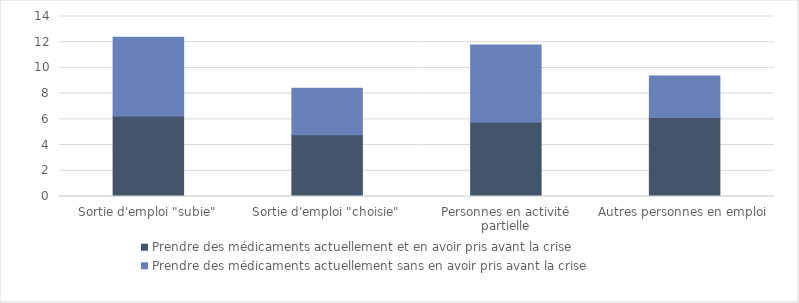
| Category | Prendre des médicaments actuellement et en avoir pris avant la crise | Prendre des médicaments actuellement sans en avoir pris avant la crise |
|---|---|---|
| Sortie d'emploi "subie" | 6.26 | 6.12 |
| Sortie d'emploi "choisie" | 4.81 | 3.6 |
| Personnes en activité partielle | 5.78 | 6 |
| Autres personnes en emploi | 6.14 | 3.24 |